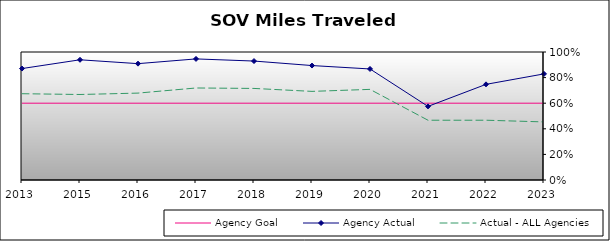
| Category | Agency Goal | Agency Actual | Actual - ALL Agencies |
|---|---|---|---|
| 2013.0 | 0.6 | 0.871 | 0.674 |
| 2015.0 | 0.6 | 0.939 | 0.668 |
| 2016.0 | 0.6 | 0.909 | 0.679 |
| 2017.0 | 0.6 | 0.946 | 0.719 |
| 2018.0 | 0.6 | 0.929 | 0.715 |
| 2019.0 | 0.6 | 0.894 | 0.692 |
| 2020.0 | 0.6 | 0.868 | 0.708 |
| 2021.0 | 0.6 | 0.575 | 0.467 |
| 2022.0 | 0.6 | 0.747 | 0.467 |
| 2023.0 | 0.6 | 0.829 | 0.454 |